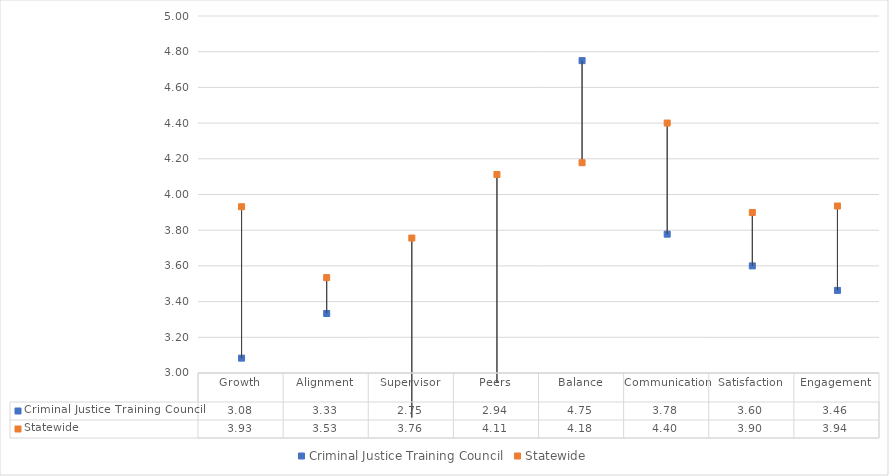
| Category | Criminal Justice Training Council | Statewide |
|---|---|---|
| Growth | 3.083 | 3.931 |
| Alignment | 3.333 | 3.534 |
| Supervisor | 2.75 | 3.756 |
| Peers | 2.944 | 4.112 |
| Balance | 4.75 | 4.178 |
| Communication | 3.778 | 4.4 |
| Satisfaction | 3.6 | 3.899 |
| Engagement | 3.463 | 3.936 |